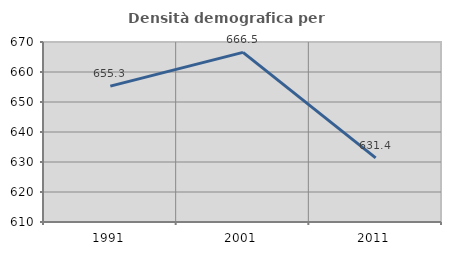
| Category | Densità demografica |
|---|---|
| 1991.0 | 655.301 |
| 2001.0 | 666.538 |
| 2011.0 | 631.381 |